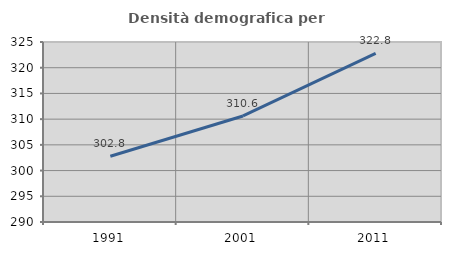
| Category | Densità demografica |
|---|---|
| 1991.0 | 302.789 |
| 2001.0 | 310.616 |
| 2011.0 | 322.804 |